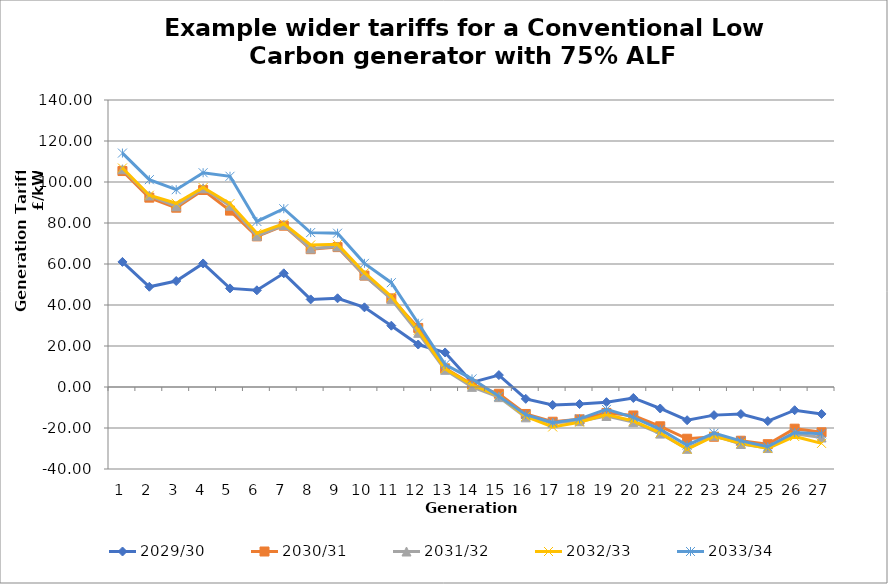
| Category | 2029/30 | 2030/31 | 2031/32 | 2032/33 | 2033/34 |
|---|---|---|---|---|---|
| 0 | 61.019 | 105.343 | 106.227 | 106.824 | 114.114 |
| 1 | 48.901 | 92.369 | 93.435 | 93.54 | 101.132 |
| 2 | 51.699 | 87.456 | 88.158 | 89.613 | 96.246 |
| 3 | 60.261 | 96.093 | 96.952 | 97.286 | 104.524 |
| 4 | 48.099 | 86.04 | 88.439 | 89.486 | 102.792 |
| 5 | 47.171 | 73.472 | 73.731 | 74.94 | 80.742 |
| 6 | 55.463 | 78.687 | 78.991 | 79.623 | 86.971 |
| 7 | 42.733 | 67.23 | 67.519 | 69.297 | 75.329 |
| 8 | 43.272 | 68.233 | 68.555 | 69.576 | 75.024 |
| 9 | 38.87 | 54.341 | 54.464 | 55.735 | 60.307 |
| 10 | 29.909 | 43.23 | 42.814 | 44.091 | 50.895 |
| 11 | 20.717 | 28.808 | 26.424 | 27.728 | 31.097 |
| 12 | 16.847 | 9.086 | 8.379 | 8.848 | 10.935 |
| 13 | 2.267 | 1.304 | 0.062 | 0.994 | 3.96 |
| 14 | 5.801 | -3.297 | -4.944 | -4.287 | -4.545 |
| 15 | -5.776 | -13.16 | -14.795 | -14.321 | -13.489 |
| 16 | -8.76 | -16.941 | -17.469 | -19.497 | -17.428 |
| 17 | -8.325 | -15.775 | -16.706 | -17.159 | -15.547 |
| 18 | -7.405 | -12.648 | -14.151 | -13.484 | -10.933 |
| 19 | -5.353 | -13.892 | -17.124 | -16.582 | -14.821 |
| 20 | -10.482 | -19.168 | -22.741 | -22.39 | -20.69 |
| 21 | -16.204 | -25.238 | -30.162 | -30.38 | -28.387 |
| 22 | -13.72 | -24.272 | -23.748 | -24.028 | -22.519 |
| 23 | -13.186 | -26.211 | -27.8 | -27.492 | -26.293 |
| 24 | -16.637 | -27.894 | -29.772 | -30.017 | -29.141 |
| 25 | -11.332 | -20.332 | -22.853 | -24.117 | -22.18 |
| 26 | -13.156 | -22.107 | -24.631 | -27.502 | -22.812 |